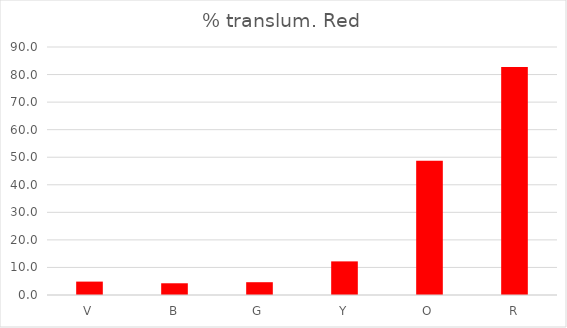
| Category | % translum. Red |
|---|---|
| V | 4.862 |
| B | 4.256 |
| G | 4.644 |
| Y | 12.2 |
| O | 48.749 |
| R | 82.746 |